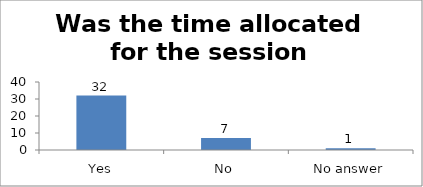
| Category | Was the time allocated for the session sufficient? |
|---|---|
| Yes | 32 |
| No | 7 |
| No answer | 1 |